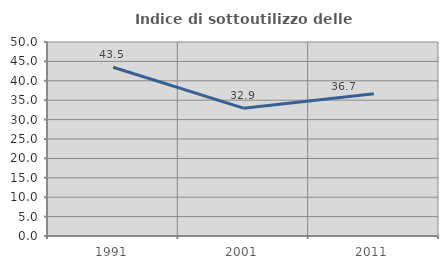
| Category | Indice di sottoutilizzo delle abitazioni  |
|---|---|
| 1991.0 | 43.478 |
| 2001.0 | 32.941 |
| 2011.0 | 36.667 |